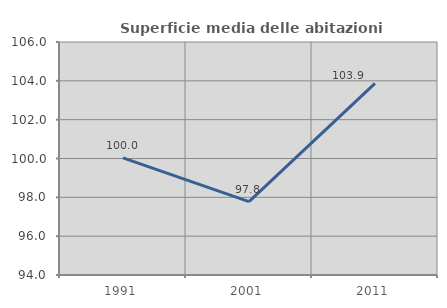
| Category | Superficie media delle abitazioni occupate |
|---|---|
| 1991.0 | 100.029 |
| 2001.0 | 97.78 |
| 2011.0 | 103.866 |